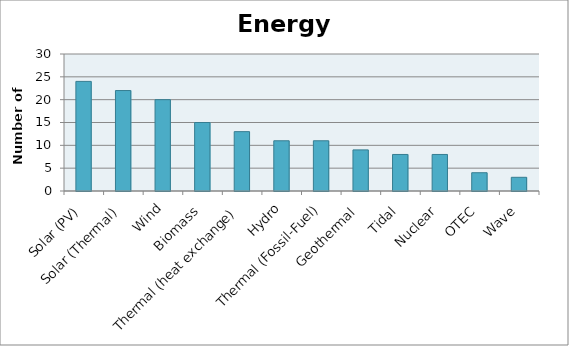
| Category | Series 0 |
|---|---|
| Solar (PV) | 24 |
| Solar (Thermal) | 22 |
| Wind | 20 |
| Biomass | 15 |
| Thermal (heat exchange) | 13 |
| Hydro | 11 |
| Thermal (Fossil-Fuel) | 11 |
| Geothermal | 9 |
| Tidal | 8 |
| Nuclear | 8 |
| OTEC | 4 |
| Wave | 3 |